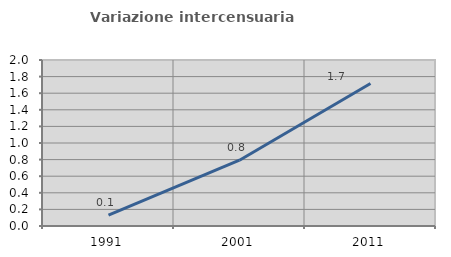
| Category | Variazione intercensuaria annua |
|---|---|
| 1991.0 | 0.131 |
| 2001.0 | 0.792 |
| 2011.0 | 1.716 |